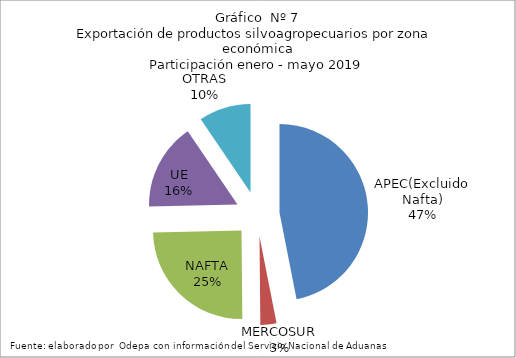
| Category | Series 0 |
|---|---|
| APEC(Excluido Nafta) | 3737337.808 |
| MERCOSUR | 234039.172 |
| NAFTA | 1974675.226 |
| UE | 1263974.184 |
| OTRAS | 757144.61 |